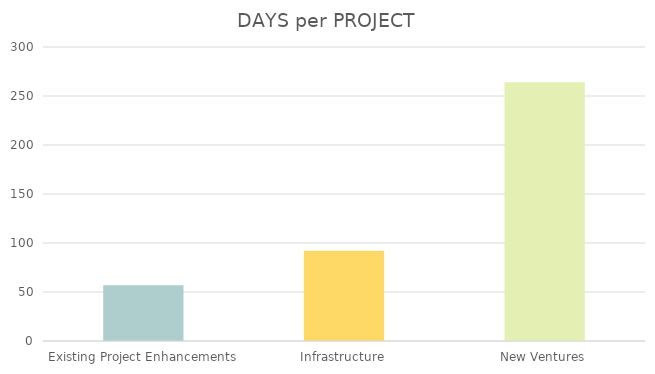
| Category | # of DAYS |
|---|---|
| Existing Project Enhancements | 57 |
| Infrastructure | 92 |
| New Ventures | 264 |